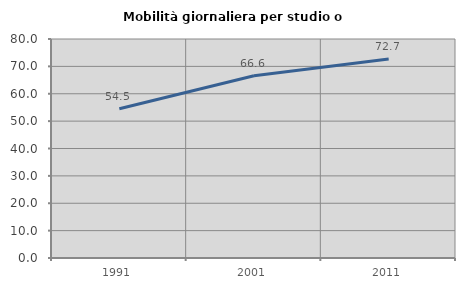
| Category | Mobilità giornaliera per studio o lavoro |
|---|---|
| 1991.0 | 54.496 |
| 2001.0 | 66.593 |
| 2011.0 | 72.672 |